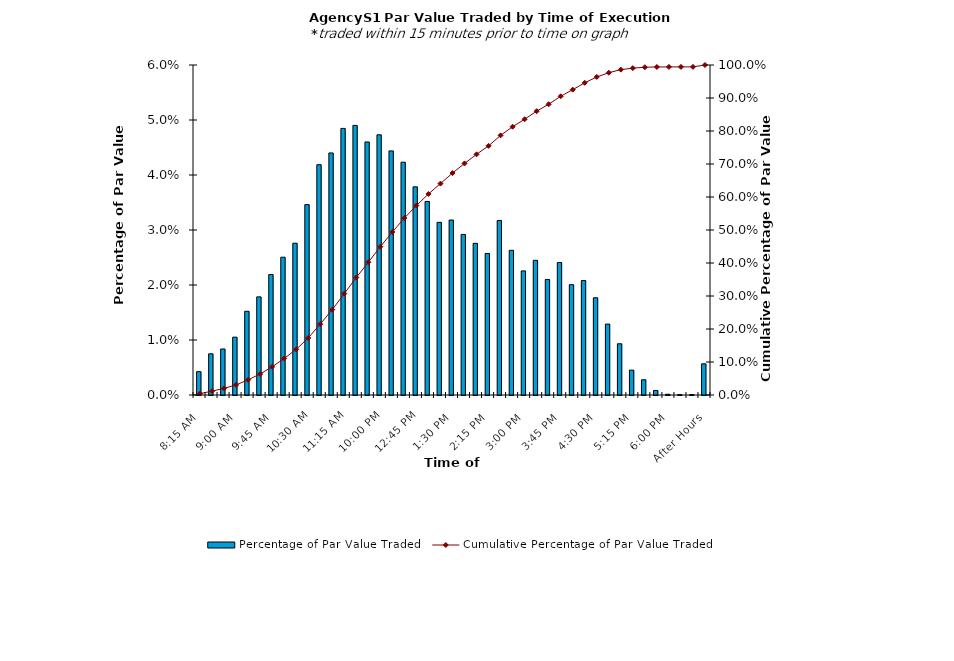
| Category | Percentage of Par Value Traded |
|---|---|
| 8:15 AM | 0.004 |
| 8:30 AM | 0.007 |
| 8:45 AM | 0.008 |
| 9:00 AM | 0.011 |
| 9:15 AM | 0.015 |
| 9:30 AM | 0.018 |
| 9:45 AM | 0.022 |
| 10:00 AM | 0.025 |
| 10:15 AM | 0.028 |
| 10:30 AM | 0.035 |
| 10:45 AM | 0.042 |
| 11:00 AM | 0.044 |
| 11:15 AM | 0.048 |
| 11:30 AM | 0.049 |
| 11:45 AM | 0.046 |
| 12:00 PM | 0.047 |
| 12:15 PM | 0.044 |
| 12:30 PM | 0.042 |
| 12:45 PM | 0.038 |
| 1:00 PM | 0.035 |
| 1:15 PM | 0.031 |
| 1:30 PM | 0.032 |
| 1:45 PM | 0.029 |
| 2:00 PM | 0.028 |
| 2:15 PM | 0.026 |
| 2:30 PM | 0.032 |
| 2:45 PM | 0.026 |
| 3:00 PM | 0.023 |
| 3:15 PM | 0.024 |
| 3:30 PM | 0.021 |
| 3:45 PM | 0.024 |
| 4:00 PM | 0.02 |
| 4:15 PM | 0.021 |
| 4:30 PM | 0.018 |
| 4:45 PM | 0.013 |
| 5:00 PM | 0.009 |
| 5:15 PM | 0.005 |
| 5:30 PM | 0.003 |
| 5:45 PM | 0.001 |
| 6:00 PM | 0 |
| 6:15 PM | 0 |
| 6:30 PM | 0 |
| After Hours | 0.006 |